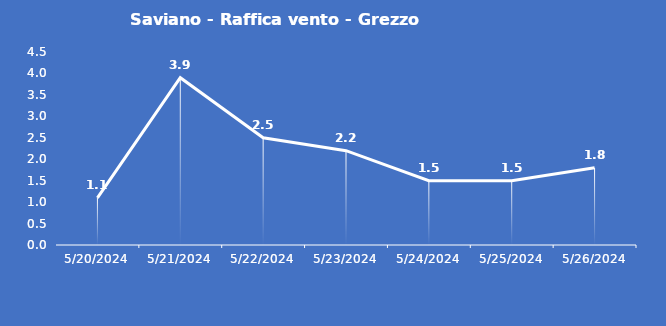
| Category | Saviano - Raffica vento - Grezzo (m/s) |
|---|---|
| 5/20/24 | 1.1 |
| 5/21/24 | 3.9 |
| 5/22/24 | 2.5 |
| 5/23/24 | 2.2 |
| 5/24/24 | 1.5 |
| 5/25/24 | 1.5 |
| 5/26/24 | 1.8 |